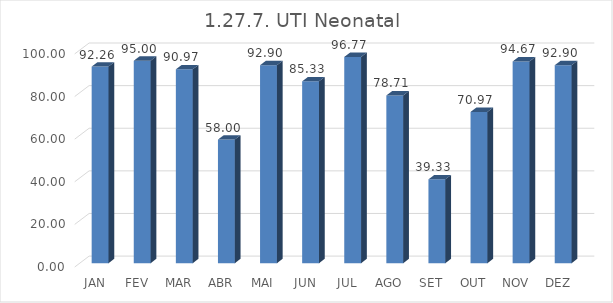
| Category | 1.27.7. UTI Neonatal  |
|---|---|
|  JAN  | 92.258 |
|  FEV  | 95 |
|  MAR  | 90.968 |
|  ABR  | 58 |
|  MAI  | 92.903 |
|  JUN  | 85.333 |
|  JUL  | 96.774 |
|  AGO  | 78.71 |
|  SET  | 39.333 |
|  OUT  | 70.968 |
|  NOV  | 94.667 |
|  DEZ  | 92.903 |